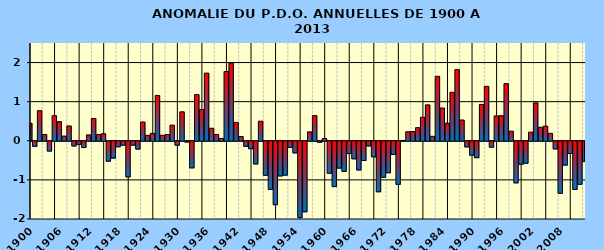
| Category | PDO |
|---|---|
| 1900.0 | 0.45 |
| 1901.0 | -0.13 |
| 1902.0 | 0.77 |
| 1903.0 | 0.16 |
| 1904.0 | -0.25 |
| 1905.0 | 0.64 |
| 1906.0 | 0.49 |
| 1907.0 | 0.12 |
| 1908.0 | 0.38 |
| 1909.0 | -0.12 |
| 1910.0 | -0.08 |
| 1911.0 | -0.16 |
| 1912.0 | 0.15 |
| 1913.0 | 0.57 |
| 1914.0 | 0.16 |
| 1915.0 | 0.18 |
| 1916.0 | -0.51 |
| 1917.0 | -0.43 |
| 1918.0 | -0.14 |
| 1919.0 | -0.1 |
| 1920.0 | -0.91 |
| 1921.0 | -0.1 |
| 1922.0 | -0.2 |
| 1923.0 | 0.48 |
| 1924.0 | 0.14 |
| 1925.0 | 0.19 |
| 1926.0 | 1.16 |
| 1927.0 | 0.14 |
| 1928.0 | 0.16 |
| 1929.0 | 0.4 |
| 1930.0 | -0.1 |
| 1931.0 | 0.74 |
| 1932.0 | -0.02 |
| 1933.0 | -0.68 |
| 1934.0 | 1.18 |
| 1935.0 | 0.8 |
| 1936.0 | 1.73 |
| 1937.0 | 0.32 |
| 1938.0 | 0.16 |
| 1939.0 | 0.06 |
| 1940.0 | 1.77 |
| 1941.0 | 1.99 |
| 1942.0 | 0.47 |
| 1943.0 | 0.11 |
| 1944.0 | -0.13 |
| 1945.0 | -0.19 |
| 1946.0 | -0.58 |
| 1947.0 | 0.5 |
| 1948.0 | -0.87 |
| 1949.0 | -1.23 |
| 1950.0 | -1.622 |
| 1951.0 | -0.886 |
| 1952.0 | -0.866 |
| 1953.0 | -0.157 |
| 1954.0 | -0.297 |
| 1955.0 | -1.948 |
| 1956.0 | -1.802 |
| 1957.0 | 0.228 |
| 1958.0 | 0.643 |
| 1959.0 | -0.027 |
| 1960.0 | 0.058 |
| 1961.0 | -0.818 |
| 1962.0 | -1.158 |
| 1963.0 | -0.686 |
| 1964.0 | -0.77 |
| 1965.0 | -0.314 |
| 1966.0 | -0.448 |
| 1967.0 | -0.734 |
| 1968.0 | -0.492 |
| 1969.0 | -0.12 |
| 1970.0 | -0.398 |
| 1971.0 | -1.291 |
| 1972.0 | -0.922 |
| 1973.0 | -0.804 |
| 1974.0 | -0.337 |
| 1975.0 | -1.102 |
| 1976.0 | 0.008 |
| 1977.0 | 0.231 |
| 1978.0 | 0.236 |
| 1979.0 | 0.335 |
| 1980.0 | 0.602 |
| 1981.0 | 0.918 |
| 1982.0 | 0.114 |
| 1983.0 | 1.648 |
| 1984.0 | 0.838 |
| 1985.0 | 0.449 |
| 1986.0 | 1.239 |
| 1987.0 | 1.821 |
| 1988.0 | 0.532 |
| 1989.0 | -0.144 |
| 1990.0 | -0.356 |
| 1991.0 | -0.419 |
| 1992.0 | 0.928 |
| 1993.0 | 1.392 |
| 1994.0 | -0.152 |
| 1995.0 | 0.637 |
| 1996.0 | 0.641 |
| 1997.0 | 1.461 |
| 1998.0 | 0.246 |
| 1999.0 | -1.063 |
| 2000.0 | -0.589 |
| 2001.0 | -0.562 |
| 2002.0 | 0.221 |
| 2003.0 | 0.969 |
| 2004.0 | 0.345 |
| 2005.0 | 0.375 |
| 2006.0 | 0.191 |
| 2007.0 | -0.196 |
| 2008.0 | -1.331 |
| 2009.0 | -0.61 |
| 2010.0 | -0.312 |
| 2011.0 | -1.231 |
| 2012.0 | -1.1 |
| 2013.0 | -0.52 |